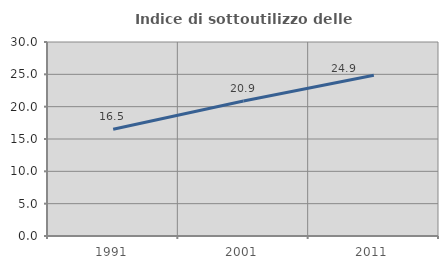
| Category | Indice di sottoutilizzo delle abitazioni  |
|---|---|
| 1991.0 | 16.505 |
| 2001.0 | 20.87 |
| 2011.0 | 24.857 |